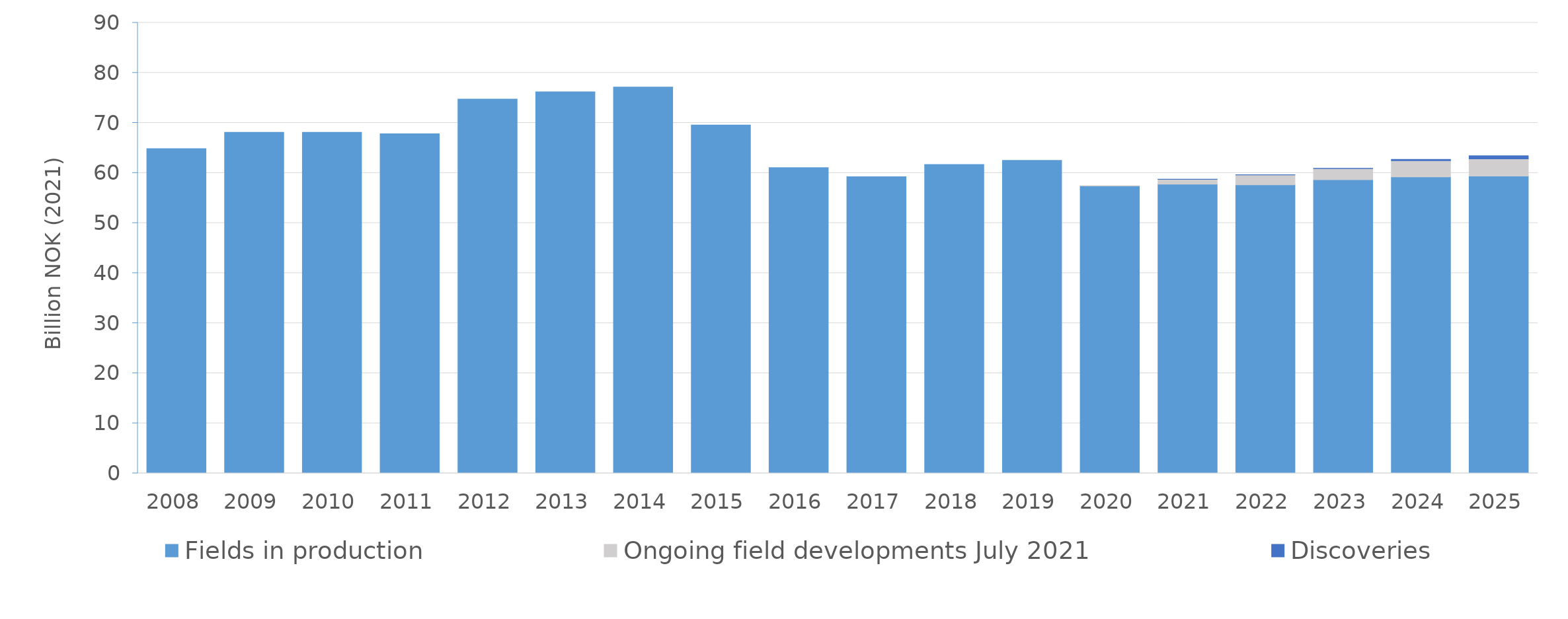
| Category | Fields in production | Ongoing field developments July 2021 | Discoveries |
|---|---|---|---|
| 2008.0 | 64.862 | 0 | 0 |
| 2009.0 | 68.117 | 0 | 0 |
| 2010.0 | 68.118 | 0 | 0 |
| 2011.0 | 67.822 | 0 | 0 |
| 2012.0 | 74.752 | 0 | 0 |
| 2013.0 | 76.207 | 0 | 0 |
| 2014.0 | 77.155 | 0 | 0 |
| 2015.0 | 69.58 | 0 | 0 |
| 2016.0 | 61.075 | 0 | 0 |
| 2017.0 | 59.238 | 0 | 0 |
| 2018.0 | 61.702 | 0 | 0 |
| 2019.0 | 62.516 | 0 | 0 |
| 2020.0 | 57.399 | 0.07 | 0 |
| 2021.0 | 57.758 | 0.98 | 0.017 |
| 2022.0 | 57.638 | 1.974 | 0.023 |
| 2023.0 | 58.645 | 2.224 | 0.07 |
| 2024.0 | 59.224 | 3.215 | 0.282 |
| 2025.0 | 59.369 | 3.457 | 0.612 |